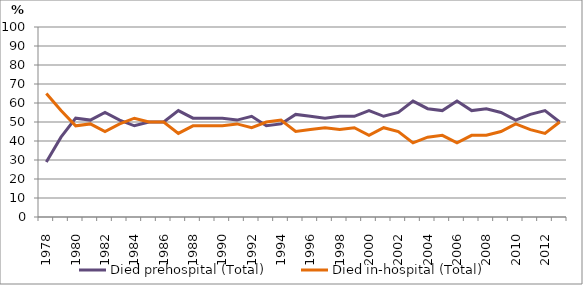
| Category | Died prehospital (Total) | Died in-hospital (Total) |
|---|---|---|
| 1978.0 | 29 | 65 |
| 1979.0 | 42 | 56 |
| 1980.0 | 52 | 48 |
| 1981.0 | 51 | 49 |
| 1982.0 | 55 | 45 |
| 1983.0 | 51 | 49 |
| 1984.0 | 48 | 52 |
| 1985.0 | 50 | 50 |
| 1986.0 | 50 | 50 |
| 1987.0 | 56 | 44 |
| 1988.0 | 52 | 48 |
| 1989.0 | 52 | 48 |
| 1990.0 | 52 | 48 |
| 1991.0 | 51 | 49 |
| 1992.0 | 53 | 47 |
| 1993.0 | 48 | 50 |
| 1994.0 | 49 | 51 |
| 1995.0 | 54 | 45 |
| 1996.0 | 53 | 46 |
| 1997.0 | 52 | 47 |
| 1998.0 | 53 | 46 |
| 1999.0 | 53 | 47 |
| 2000.0 | 56 | 43 |
| 2001.0 | 53 | 47 |
| 2002.0 | 55 | 45 |
| 2003.0 | 61 | 39 |
| 2004.0 | 57 | 42 |
| 2005.0 | 56 | 43 |
| 2006.0 | 61 | 39 |
| 2007.0 | 56 | 43 |
| 2008.0 | 57 | 43 |
| 2009.0 | 55 | 45 |
| 2010.0 | 51 | 49 |
| 2011.0 | 54 | 46 |
| 2012.0 | 56 | 44 |
| 2013.0 | 50 | 50 |